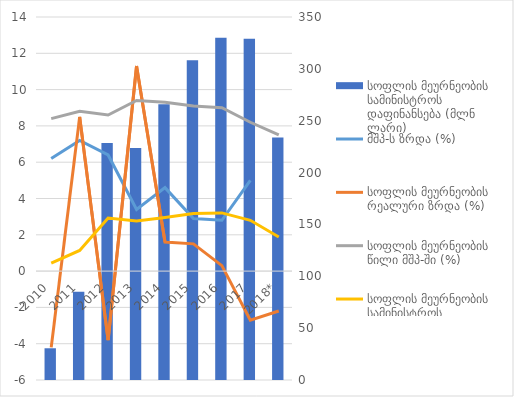
| Category | სოფლის მეურნეობის სამინისტროს დაფინანსება (მლნ ლარი) |
|---|---|
| 2010 | 30.6 |
| 2011 | 85.1 |
| 2012 | 228.4 |
| 2013 | 223.6 |
| 2014 | 265.8 |
| 2015 | 308.2 |
| 2016 | 330 |
| 2017 | 329.1 |
| 2018* | 233.9 |